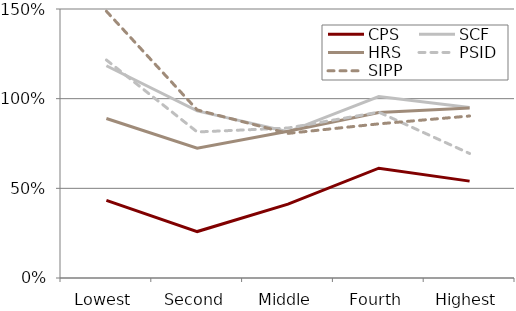
| Category | CPS | SCF | HRS | PSID | SIPP |
|---|---|---|---|---|---|
| Lowest | 0.433 | 1.184 | 0.889 | 1.216 | 1.488 |
| Second | 0.259 | 0.932 | 0.724 | 0.814 | 0.937 |
| Middle | 0.412 | 0.815 | 0.819 | 0.836 | 0.806 |
| Fourth | 0.612 | 1.011 | 0.923 | 0.925 | 0.86 |
| Highest | 0.54 | 0.95 | 0.948 | 0.694 | 0.903 |